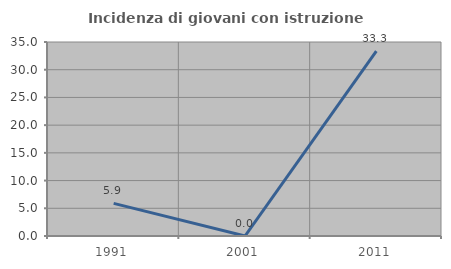
| Category | Incidenza di giovani con istruzione universitaria |
|---|---|
| 1991.0 | 5.882 |
| 2001.0 | 0 |
| 2011.0 | 33.333 |